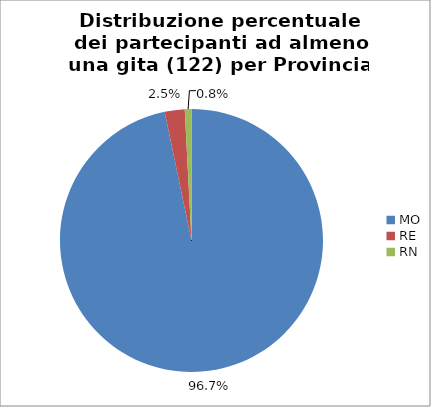
| Category | Nr. Tesserati |
|---|---|
| MO | 118 |
| RE | 3 |
| RN | 1 |